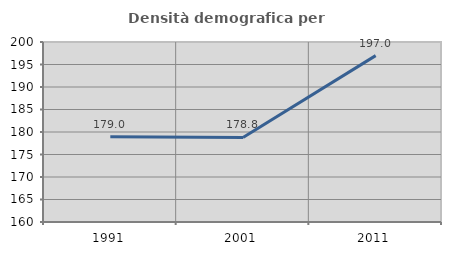
| Category | Densità demografica |
|---|---|
| 1991.0 | 178.969 |
| 2001.0 | 178.786 |
| 2011.0 | 196.971 |